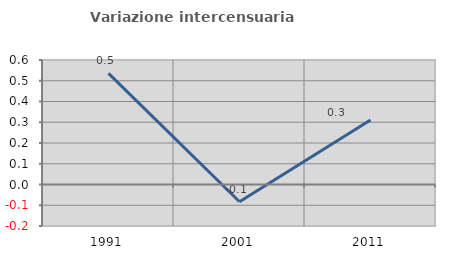
| Category | Variazione intercensuaria annua |
|---|---|
| 1991.0 | 0.535 |
| 2001.0 | -0.083 |
| 2011.0 | 0.311 |